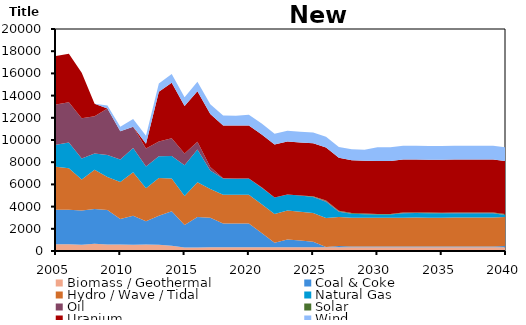
| Category | Biomass / Geothermal | Coal & Coke | Hydro / Wave / Tidal | Natural Gas | Oil | Solar | Uranium | Wind |
|---|---|---|---|---|---|---|---|---|
| 2005.0 | 610 | 3101.052 | 3875 | 1980 | 3622.764 | 0 | 4378 | 0 |
| 2006.0 | 610 | 3107.928 | 3731 | 2332 | 3622.788 | 0 | 4366 | 0 |
| 2007.0 | 562 | 3093.977 | 2793.761 | 1876 | 3622.739 | 0 | 4119 | 0 |
| 2008.0 | 647 | 3127.393 | 3536.094 | 1483 | 3341.973 | 0 | 1129 | 0 |
| 2009.0 | 576 | 3123.341 | 2964.241 | 1974 | 4200.748 | 0 | 0 | 270 |
| 2010.0 | 585 | 2308.09 | 3325.349 | 2035 | 2546.01 | 0 | 0 | 389 |
| 2011.0 | 569 | 2613.65 | 3921.287 | 2177 | 1910.48 | 0 | 0 | 693 |
| 2012.0 | 579 | 2110.213 | 2957.281 | 1967 | 1629.301 | 0 | 409 | 733 |
| 2013.0 | 558 | 2612.516 | 3410.312 | 1966 | 1323.384 | 0 | 4479 | 737 |
| 2014.0 | 474.7 | 3100.204 | 2963.114 | 2016.2 | 1592.595 | 0 | 5012.22 | 785.85 |
| 2015.0 | 307 | 2036.389 | 2615.121 | 2762.5 | 1070.912 | 0 | 4277.036 | 792.082 |
| 2016.0 | 326.2 | 2733.137 | 3133.632 | 2949 | 702.563 | 0 | 4544.84 | 856.274 |
| 2017.0 | 340.1 | 2657.768 | 2597.612 | 1652.6 | 316.133 | 0 | 4770.25 | 891.827 |
| 2018.0 | 340.1 | 2138.763 | 2597.624 | 1455.302 | 11.216 | 0 | 4770.258 | 891.833 |
| 2019.0 | 340.1 | 2138.604 | 2597.607 | 1443.877 | 9.991 | 0 | 4770.258 | 891.825 |
| 2020.0 | 340.1 | 2138.604 | 2597.618 | 1444.828 | 9.991 | 0 | 4770.258 | 973.999 |
| 2021.0 | 340.1 | 1282.684 | 2597.605 | 1469.422 | 45.044 | 0 | 4770.258 | 973.992 |
| 2022.0 | 340.1 | 406.191 | 2597.597 | 1469.417 | 10.331 | 0 | 4770.258 | 973.989 |
| 2023.0 | 340.1 | 705.648 | 2597.624 | 1447.837 | 6.12 | 0 | 4770.258 | 974.002 |
| 2024.0 | 340.1 | 608.813 | 2597.604 | 1448.112 | 5.776 | 0 | 4770.258 | 973.992 |
| 2025.0 | 340.1 | 496.887 | 2597.618 | 1440.127 | 4.161 | 52.56 | 4770.258 | 973.999 |
| 2026.0 | 340.1 | 28.464 | 2597.604 | 1480.47 | 51.349 | 52.56 | 4770.258 | 973.992 |
| 2027.0 | 340.1 | 120.623 | 2597.6 | 484.594 | 29.457 | 52.56 | 4770.258 | 973.989 |
| 2028.0 | 340.1 | 68.751 | 2597.627 | 348.388 | 5.075 | 52.56 | 4770.258 | 974.004 |
| 2029.0 | 340.1 | 68.435 | 2597.594 | 306.635 | 2.639 | 52.56 | 4770.258 | 973.987 |
| 2030.0 | 340.1 | 68.435 | 2597.598 | 272.324 | 2.639 | 52.56 | 4770.258 | 1236.786 |
| 2031.0 | 340.1 | 68.435 | 2597.624 | 276.579 | 2.639 | 52.56 | 4770.258 | 1236.806 |
| 2032.0 | 340.1 | 68.857 | 2597.624 | 396.838 | 13.286 | 52.56 | 4770.258 | 1236.801 |
| 2033.0 | 340.1 | 69.069 | 2597.609 | 406.186 | 13.541 | 52.56 | 4770.258 | 1236.793 |
| 2034.0 | 340.1 | 68.91 | 2597.597 | 387.844 | 11.836 | 52.56 | 4770.258 | 1236.787 |
| 2035.0 | 340.1 | 68.91 | 2597.625 | 385.041 | 11.318 | 52.56 | 4770.258 | 1236.803 |
| 2036.0 | 340.1 | 69.069 | 2597.593 | 400.381 | 11.796 | 52.56 | 4770.258 | 1236.785 |
| 2037.0 | 340.1 | 69.069 | 2597.605 | 397.361 | 10.972 | 52.56 | 4770.258 | 1236.792 |
| 2038.0 | 340.1 | 69.069 | 2597.62 | 394.263 | 15.148 | 52.56 | 4770.258 | 1236.801 |
| 2039.0 | 340.1 | 69.069 | 2597.595 | 391.127 | 22.317 | 58.692 | 4770.258 | 1236.786 |
| 2040.0 | 340.1 | 120.255 | 2597.619 | 161.62 | 41.596 | 64.824 | 4770.258 | 1236.8 |